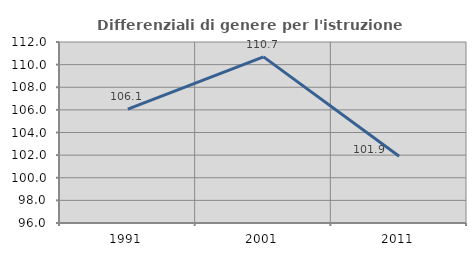
| Category | Differenziali di genere per l'istruzione superiore |
|---|---|
| 1991.0 | 106.075 |
| 2001.0 | 110.684 |
| 2011.0 | 101.899 |